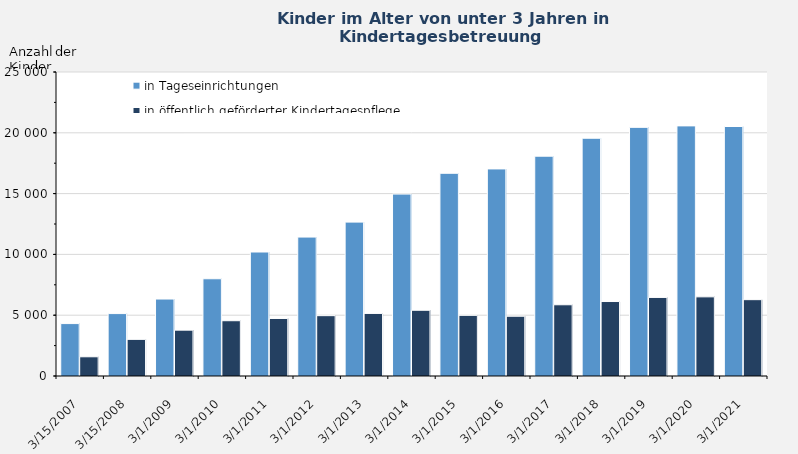
| Category | in Tageseinrichtungen | in öffentlich geförderter Kindertagespflege 
(„Tagesmütter/ -väter“) |
|---|---|---|
| 3/15/07 | 4310 | 1580 |
| 3/15/08 | 5133 | 3013 |
| 3/1/09 | 6329 | 3770 |
| 3/1/10 | 7997 | 4545 |
| 3/1/11 | 10197 | 4731 |
| 3/1/12 | 11425 | 4962 |
| 3/1/13 | 12655 | 5146 |
| 3/1/14 | 14961 | 5405 |
| 3/1/15 | 16670 | 4987 |
| 3/1/16 | 17029 | 4915 |
| 3/1/17 | 18076 | 5857 |
| 3/1/18 | 19553 | 6125 |
| 3/1/19 | 20448 | 6461 |
| 3/1/20 | 20569 | 6509 |
| 3/1/21 | 20518 | 6278 |